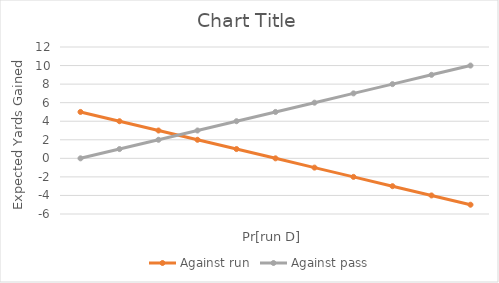
| Category | Against run | Against pass |
|---|---|---|
| 0 | 5 | 0 |
| 1 | 4 | 1 |
| 2 | 3 | 2 |
| 3 | 2 | 3 |
| 4 | 1 | 4 |
| 5 | 0 | 5 |
| 6 | -1 | 6 |
| 7 | -2 | 7 |
| 8 | -3 | 8 |
| 9 | -4 | 9 |
| 10 | -5 | 10 |